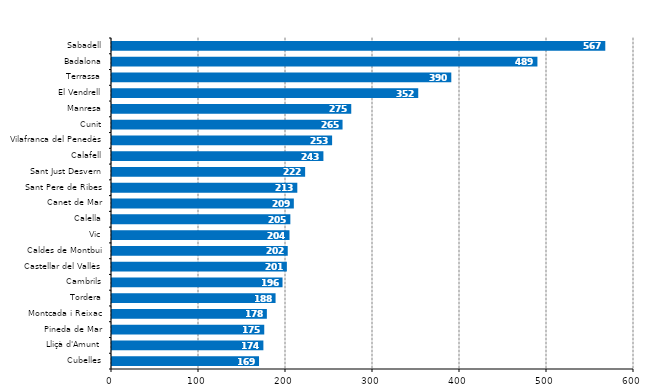
| Category | Series 0 |
|---|---|
| Sabadell | 567 |
| Badalona | 489 |
| Terrassa | 390 |
| El Vendrell | 352 |
| Manresa | 275 |
| Cunit | 265 |
| Vilafranca del Penedès | 253 |
| Calafell | 243 |
| Sant Just Desvern | 222 |
| Sant Pere de Ribes | 213 |
| Canet de Mar | 209 |
| Calella | 205 |
| Vic | 204 |
| Caldes de Montbui | 202 |
| Castellar del Vallès | 201 |
| Cambrils | 196 |
| Tordera | 188 |
| Montcada i Reixac | 178 |
| Pineda de Mar | 175 |
| Lliçà d'Amunt | 174 |
| Cubelles | 169 |